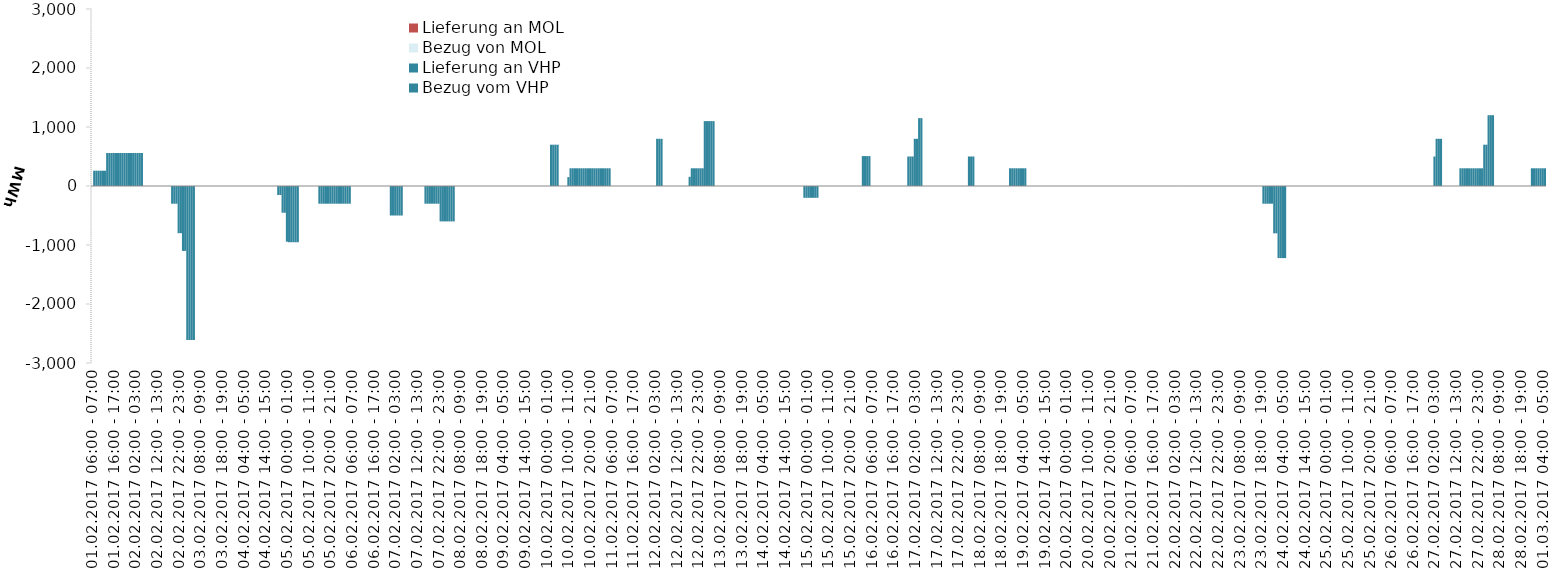
| Category | Bezug vom VHP | Lieferung an VHP | Bezug von MOL | Lieferung an MOL |
|---|---|---|---|---|
| 01.02.2017 06:00 - 07:00 | 0 | 0 | 0 | 0 |
| 01.02.2017 07:00 - 08:00 | 259 | 0 | 0 | 0 |
| 01.02.2017 08:00 - 09:00 | 259 | 0 | 0 | 0 |
| 01.02.2017 09:00 - 10:00 | 259 | 0 | 0 | 0 |
| 01.02.2017 10:00 - 11:00 | 259 | 0 | 0 | 0 |
| 01.02.2017 11:00 - 12:00 | 259 | 0 | 0 | 0 |
| 01.02.2017 12:00 - 13:00 | 259 | 0 | 0 | 0 |
| 01.02.2017 13:00 - 14:00 | 559 | 0 | 0 | 0 |
| 01.02.2017 14:00 - 15:00 | 559 | 0 | 0 | 0 |
| 01.02.2017 15:00 - 16:00 | 559 | 0 | 0 | 0 |
| 01.02.2017 16:00 - 17:00 | 559 | 0 | 0 | 0 |
| 01.02.2017 17:00 - 18:00 | 559 | 0 | 0 | 0 |
| 01.02.2017 18:00 - 19:00 | 559 | 0 | 0 | 0 |
| 01.02.2017 19:00 - 20:00 | 559 | 0 | 0 | 0 |
| 01.02.2017 20:00 - 21:00 | 559 | 0 | 0 | 0 |
| 01.02.2017 21:00 - 22:00 | 559 | 0 | 0 | 0 |
| 01.02.2017 22:00 - 23:00 | 559 | 0 | 0 | 0 |
| 01.02.2017 23:00 - 24:00 | 559 | 0 | 0 | 0 |
| 02.02.2017 00:00 - 01:00 | 559 | 0 | 0 | 0 |
| 02.02.2017 01:00 - 02:00 | 559 | 0 | 0 | 0 |
| 02.02.2017 02:00 - 03:00 | 559 | 0 | 0 | 0 |
| 02.02.2017 03:00 - 04:00 | 559 | 0 | 0 | 0 |
| 02.02.2017 04:00 - 05:00 | 559 | 0 | 0 | 0 |
| 02.02.2017 05:00 - 06:00 | 559 | 0 | 0 | 0 |
| 02.02.2017 06:00 - 07:00 | 0 | 0 | 0 | 0 |
| 02.02.2017 07:00 - 08:00 | 0 | 0 | 0 | 0 |
| 02.02.2017 08:00 - 09:00 | 0 | 0 | 0 | 0 |
| 02.02.2017 09:00 - 10:00 | 0 | 0 | 0 | 0 |
| 02.02.2017 10:00 - 11:00 | 0 | 0 | 0 | 0 |
| 02.02.2017 11:00 - 12:00 | 0 | 0 | 0 | 0 |
| 02.02.2017 12:00 - 13:00 | 0 | 0 | 0 | 0 |
| 02.02.2017 13:00 - 14:00 | 0 | 0 | 0 | 0 |
| 02.02.2017 14:00 - 15:00 | 0 | 0 | 0 | 0 |
| 02.02.2017 15:00 - 16:00 | 0 | 0 | 0 | 0 |
| 02.02.2017 16:00 - 17:00 | 0 | 0 | 0 | 0 |
| 02.02.2017 17:00 - 18:00 | 0 | 0 | 0 | 0 |
| 02.02.2017 18:00 - 19:00 | 0 | 0 | 0 | 0 |
| 02.02.2017 19:00 - 20:00 | 0 | -300 | 0 | 0 |
| 02.02.2017 20:00 - 21:00 | 0 | -300 | 0 | 0 |
| 02.02.2017 21:00 - 22:00 | 0 | -300 | 0 | 0 |
| 02.02.2017 22:00 - 23:00 | 0 | -800 | 0 | 0 |
| 02.02.2017 23:00 - 24:00 | 0 | -800 | 0 | 0 |
| 03.02.2017 00:00 - 01:00 | 0 | -1100 | 0 | 0 |
| 03.02.2017 01:00 - 02:00 | 0 | -1100 | 0 | 0 |
| 03.02.2017 02:00 - 03:00 | 0 | -2610 | 0 | 0 |
| 03.02.2017 03:00 - 04:00 | 0 | -2610 | 0 | 0 |
| 03.02.2017 04:00 - 05:00 | 0 | -2610 | 0 | 0 |
| 03.02.2017 05:00 - 06:00 | 0 | -2610 | 0 | 0 |
| 03.02.2017 06:00 - 07:00 | 0 | 0 | 0 | 0 |
| 03.02.2017 07:00 - 08:00 | 0 | 0 | 0 | 0 |
| 03.02.2017 08:00 - 09:00 | 0 | 0 | 0 | 0 |
| 03.02.2017 09:00 - 10:00 | 0 | 0 | 0 | 0 |
| 03.02.2017 10:00 - 11:00 | 0 | 0 | 0 | 0 |
| 03.02.2017 11:00 - 12:00 | 0 | 0 | 0 | 0 |
| 03.02.2017 12:00 - 13:00 | 0 | 0 | 0 | 0 |
| 03.02.2017 13:00 - 14:00 | 0 | 0 | 0 | 0 |
| 03.02.2017 14:00 - 15:00 | 0 | 0 | 0 | 0 |
| 03.02.2017 15:00 - 16:00 | 0 | 0 | 0 | 0 |
| 03.02.2017 16:00 - 17:00 | 0 | 0 | 0 | 0 |
| 03.02.2017 17:00 - 18:00 | 0 | 0 | 0 | 0 |
| 03.02.2017 18:00 - 19:00 | 0 | 0 | 0 | 0 |
| 03.02.2017 19:00 - 20:00 | 0 | 0 | 0 | 0 |
| 03.02.2017 20:00 - 21:00 | 0 | 0 | 0 | 0 |
| 03.02.2017 21:00 - 22:00 | 0 | 0 | 0 | 0 |
| 03.02.2017 22:00 - 23:00 | 0 | 0 | 0 | 0 |
| 03.02.2017 23:00 - 24:00 | 0 | 0 | 0 | 0 |
| 04.02.2017 00:00 - 01:00 | 0 | 0 | 0 | 0 |
| 04.02.2017 01:00 - 02:00 | 0 | 0 | 0 | 0 |
| 04.02.2017 02:00 - 03:00 | 0 | 0 | 0 | 0 |
| 04.02.2017 03:00 - 04:00 | 0 | 0 | 0 | 0 |
| 04.02.2017 04:00 - 05:00 | 0 | 0 | 0 | 0 |
| 04.02.2017 05:00 - 06:00 | 0 | 0 | 0 | 0 |
| 04.02.2017 06:00 - 07:00 | 0 | 0 | 0 | 0 |
| 04.02.2017 07:00 - 08:00 | 0 | 0 | 0 | 0 |
| 04.02.2017 08:00 - 09:00 | 0 | 0 | 0 | 0 |
| 04.02.2017 09:00 - 10:00 | 0 | 0 | 0 | 0 |
| 04.02.2017 10:00 - 11:00 | 0 | 0 | 0 | 0 |
| 04.02.2017 11:00 - 12:00 | 0 | 0 | 0 | 0 |
| 04.02.2017 12:00 - 13:00 | 0 | 0 | 0 | 0 |
| 04.02.2017 13:00 - 14:00 | 0 | 0 | 0 | 0 |
| 04.02.2017 14:00 - 15:00 | 0 | 0 | 0 | 0 |
| 04.02.2017 15:00 - 16:00 | 0 | 0 | 0 | 0 |
| 04.02.2017 16:00 - 17:00 | 0 | 0 | 0 | 0 |
| 04.02.2017 17:00 - 18:00 | 0 | 0 | 0 | 0 |
| 04.02.2017 18:00 - 19:00 | 0 | 0 | 0 | 0 |
| 04.02.2017 19:00 - 20:00 | 0 | 0 | 0 | 0 |
| 04.02.2017 20:00 - 21:00 | 0 | -153 | 0 | 0 |
| 04.02.2017 21:00 - 22:00 | 0 | -153 | 0 | 0 |
| 04.02.2017 22:00 - 23:00 | 0 | -453 | 0 | 0 |
| 04.02.2017 23:00 - 24:00 | 0 | -453 | 0 | 0 |
| 05.02.2017 00:00 - 01:00 | 0 | -944 | 0 | 0 |
| 05.02.2017 01:00 - 02:00 | 0 | -953 | 0 | 0 |
| 05.02.2017 02:00 - 03:00 | 0 | -953 | 0 | 0 |
| 05.02.2017 03:00 - 04:00 | 0 | -953 | 0 | 0 |
| 05.02.2017 04:00 - 05:00 | 0 | -953 | 0 | 0 |
| 05.02.2017 05:00 - 06:00 | 0 | -953 | 0 | 0 |
| 05.02.2017 06:00 - 07:00 | 0 | 0 | 0 | 0 |
| 05.02.2017 07:00 - 08:00 | 0 | 0 | 0 | 0 |
| 05.02.2017 08:00 - 09:00 | 0 | 0 | 0 | 0 |
| 05.02.2017 09:00 - 10:00 | 0 | 0 | 0 | 0 |
| 05.02.2017 10:00 - 11:00 | 0 | 0 | 0 | 0 |
| 05.02.2017 11:00 - 12:00 | 0 | 0 | 0 | 0 |
| 05.02.2017 12:00 - 13:00 | 0 | 0 | 0 | 0 |
| 05.02.2017 13:00 - 14:00 | 0 | 0 | 0 | 0 |
| 05.02.2017 14:00 - 15:00 | 0 | 0 | 0 | 0 |
| 05.02.2017 15:00 - 16:00 | 0 | -300 | 0 | 0 |
| 05.02.2017 16:00 - 17:00 | 0 | -300 | 0 | 0 |
| 05.02.2017 17:00 - 18:00 | 0 | -300 | 0 | 0 |
| 05.02.2017 18:00 - 19:00 | 0 | -300 | 0 | 0 |
| 05.02.2017 19:00 - 20:00 | 0 | -300 | 0 | 0 |
| 05.02.2017 20:00 - 21:00 | 0 | -300 | 0 | 0 |
| 05.02.2017 21:00 - 22:00 | 0 | -300 | 0 | 0 |
| 05.02.2017 22:00 - 23:00 | 0 | -300 | 0 | 0 |
| 05.02.2017 23:00 - 24:00 | 0 | -300 | 0 | 0 |
| 06.02.2017 00:00 - 01:00 | 0 | -300 | 0 | 0 |
| 06.02.2017 01:00 - 02:00 | 0 | -300 | 0 | 0 |
| 06.02.2017 02:00 - 03:00 | 0 | -300 | 0 | 0 |
| 06.02.2017 03:00 - 04:00 | 0 | -300 | 0 | 0 |
| 06.02.2017 04:00 - 05:00 | 0 | -300 | 0 | 0 |
| 06.02.2017 05:00 - 06:00 | 0 | -300 | 0 | 0 |
| 06.02.2017 06:00 - 07:00 | 0 | 0 | 0 | 0 |
| 06.02.2017 07:00 - 08:00 | 0 | 0 | 0 | 0 |
| 06.02.2017 08:00 - 09:00 | 0 | 0 | 0 | 0 |
| 06.02.2017 09:00 - 10:00 | 0 | 0 | 0 | 0 |
| 06.02.2017 10:00 - 11:00 | 0 | 0 | 0 | 0 |
| 06.02.2017 11:00 - 12:00 | 0 | 0 | 0 | 0 |
| 06.02.2017 12:00 - 13:00 | 0 | 0 | 0 | 0 |
| 06.02.2017 13:00 - 14:00 | 0 | 0 | 0 | 0 |
| 06.02.2017 14:00 - 15:00 | 0 | 0 | 0 | 0 |
| 06.02.2017 15:00 - 16:00 | 0 | 0 | 0 | 0 |
| 06.02.2017 16:00 - 17:00 | 0 | 0 | 0 | 0 |
| 06.02.2017 17:00 - 18:00 | 0 | 0 | 0 | 0 |
| 06.02.2017 18:00 - 19:00 | 0 | 0 | 0 | 0 |
| 06.02.2017 19:00 - 20:00 | 0 | 0 | 0 | 0 |
| 06.02.2017 20:00 - 21:00 | 0 | 0 | 0 | 0 |
| 06.02.2017 21:00 - 22:00 | 0 | 0 | 0 | 0 |
| 06.02.2017 22:00 - 23:00 | 0 | 0 | 0 | 0 |
| 06.02.2017 23:00 - 24:00 | 0 | 0 | 0 | 0 |
| 07.02.2017 00:00 - 01:00 | 0 | -500 | 0 | 0 |
| 07.02.2017 01:00 - 02:00 | 0 | -500 | 0 | 0 |
| 07.02.2017 02:00 - 03:00 | 0 | -500 | 0 | 0 |
| 07.02.2017 03:00 - 04:00 | 0 | -500 | 0 | 0 |
| 07.02.2017 04:00 - 05:00 | 0 | -500 | 0 | 0 |
| 07.02.2017 05:00 - 06:00 | 0 | -500 | 0 | 0 |
| 07.02.2017 06:00 - 07:00 | 0 | 0 | 0 | 0 |
| 07.02.2017 07:00 - 08:00 | 0 | 0 | 0 | 0 |
| 07.02.2017 08:00 - 09:00 | 0 | 0 | 0 | 0 |
| 07.02.2017 09:00 - 10:00 | 0 | 0 | 0 | 0 |
| 07.02.2017 10:00 - 11:00 | 0 | 0 | 0 | 0 |
| 07.02.2017 11:00 - 12:00 | 0 | 0 | 0 | 0 |
| 07.02.2017 12:00 - 13:00 | 0 | 0 | 0 | 0 |
| 07.02.2017 13:00 - 14:00 | 0 | 0 | 0 | 0 |
| 07.02.2017 14:00 - 15:00 | 0 | 0 | 0 | 0 |
| 07.02.2017 15:00 - 16:00 | 0 | 0 | 0 | 0 |
| 07.02.2017 16:00 - 17:00 | 0 | -300 | 0 | 0 |
| 07.02.2017 17:00 - 18:00 | 0 | -300 | 0 | 0 |
| 07.02.2017 18:00 - 19:00 | 0 | -300 | 0 | 0 |
| 07.02.2017 19:00 - 20:00 | 0 | -300 | 0 | 0 |
| 07.02.2017 20:00 - 21:00 | 0 | -300 | 0 | 0 |
| 07.02.2017 21:00 - 22:00 | 0 | -300 | 0 | 0 |
| 07.02.2017 22:00 - 23:00 | 0 | -300 | 0 | 0 |
| 07.02.2017 23:00 - 24:00 | 0 | -600 | 0 | 0 |
| 08.02.2017 00:00 - 01:00 | 0 | -600 | 0 | 0 |
| 08.02.2017 01:00 - 02:00 | 0 | -600 | 0 | 0 |
| 08.02.2017 02:00 - 03:00 | 0 | -600 | 0 | 0 |
| 08.02.2017 03:00 - 04:00 | 0 | -600 | 0 | 0 |
| 08.02.2017 04:00 - 05:00 | 0 | -600 | 0 | 0 |
| 08.02.2017 05:00 - 06:00 | 0 | -600 | 0 | 0 |
| 08.02.2017 06:00 - 07:00 | 0 | 0 | 0 | 0 |
| 08.02.2017 07:00 - 08:00 | 0 | 0 | 0 | 0 |
| 08.02.2017 08:00 - 09:00 | 0 | 0 | 0 | 0 |
| 08.02.2017 09:00 - 10:00 | 0 | 0 | 0 | 0 |
| 08.02.2017 10:00 - 11:00 | 0 | 0 | 0 | 0 |
| 08.02.2017 11:00 - 12:00 | 0 | 0 | 0 | 0 |
| 08.02.2017 12:00 - 13:00 | 0 | 0 | 0 | 0 |
| 08.02.2017 13:00 - 14:00 | 0 | 0 | 0 | 0 |
| 08.02.2017 14:00 - 15:00 | 0 | 0 | 0 | 0 |
| 08.02.2017 15:00 - 16:00 | 0 | 0 | 0 | 0 |
| 08.02.2017 16:00 - 17:00 | 0 | 0 | 0 | 0 |
| 08.02.2017 17:00 - 18:00 | 0 | 0 | 0 | 0 |
| 08.02.2017 18:00 - 19:00 | 0 | 0 | 0 | 0 |
| 08.02.2017 19:00 - 20:00 | 0 | 0 | 0 | 0 |
| 08.02.2017 20:00 - 21:00 | 0 | 0 | 0 | 0 |
| 08.02.2017 21:00 - 22:00 | 0 | 0 | 0 | 0 |
| 08.02.2017 22:00 - 23:00 | 0 | 0 | 0 | 0 |
| 08.02.2017 23:00 - 24:00 | 0 | 0 | 0 | 0 |
| 09.02.2017 00:00 - 01:00 | 0 | 0 | 0 | 0 |
| 09.02.2017 01:00 - 02:00 | 0 | 0 | 0 | 0 |
| 09.02.2017 02:00 - 03:00 | 0 | 0 | 0 | 0 |
| 09.02.2017 03:00 - 04:00 | 0 | 0 | 0 | 0 |
| 09.02.2017 04:00 - 05:00 | 0 | 0 | 0 | 0 |
| 09.02.2017 05:00 - 06:00 | 0 | 0 | 0 | 0 |
| 09.02.2017 06:00 - 07:00 | 0 | 0 | 0 | 0 |
| 09.02.2017 07:00 - 08:00 | 0 | 0 | 0 | 0 |
| 09.02.2017 08:00 - 09:00 | 0 | 0 | 0 | 0 |
| 09.02.2017 09:00 - 10:00 | 0 | 0 | 0 | 0 |
| 09.02.2017 10:00 - 11:00 | 0 | 0 | 0 | 0 |
| 09.02.2017 11:00 - 12:00 | 0 | 0 | 0 | 0 |
| 09.02.2017 12:00 - 13:00 | 0 | 0 | 0 | 0 |
| 09.02.2017 13:00 - 14:00 | 0 | 0 | 0 | 0 |
| 09.02.2017 14:00 - 15:00 | 0 | 0 | 0 | 0 |
| 09.02.2017 15:00 - 16:00 | 0 | 0 | 0 | 0 |
| 09.02.2017 16:00 - 17:00 | 0 | 0 | 0 | 0 |
| 09.02.2017 17:00 - 18:00 | 0 | 0 | 0 | 0 |
| 09.02.2017 18:00 - 19:00 | 0 | 0 | 0 | 0 |
| 09.02.2017 19:00 - 20:00 | 0 | 0 | 0 | 0 |
| 09.02.2017 20:00 - 21:00 | 0 | 0 | 0 | 0 |
| 09.02.2017 21:00 - 22:00 | 0 | 0 | 0 | 0 |
| 09.02.2017 22:00 - 23:00 | 0 | 0 | 0 | 0 |
| 09.02.2017 23:00 - 24:00 | 0 | 0 | 0 | 0 |
| 10.02.2017 00:00 - 01:00 | 0 | 0 | 0 | 0 |
| 10.02.2017 01:00 - 02:00 | 0 | 0 | 0 | 0 |
| 10.02.2017 02:00 - 03:00 | 700 | 0 | 0 | 0 |
| 10.02.2017 03:00 - 04:00 | 700 | 0 | 0 | 0 |
| 10.02.2017 04:00 - 05:00 | 700 | 0 | 0 | 0 |
| 10.02.2017 05:00 - 06:00 | 700 | 0 | 0 | 0 |
| 10.02.2017 06:00 - 07:00 | 0 | 0 | 0 | 0 |
| 10.02.2017 07:00 - 08:00 | 0 | 0 | 0 | 0 |
| 10.02.2017 08:00 - 09:00 | 0 | 0 | 0 | 0 |
| 10.02.2017 09:00 - 10:00 | 0 | 0 | 0 | 0 |
| 10.02.2017 10:00 - 11:00 | 150 | 0 | 0 | 0 |
| 10.02.2017 11:00 - 12:00 | 300 | 0 | 0 | 0 |
| 10.02.2017 12:00 - 13:00 | 300 | 0 | 0 | 0 |
| 10.02.2017 13:00 - 14:00 | 300 | 0 | 0 | 0 |
| 10.02.2017 14:00 - 15:00 | 300 | 0 | 0 | 0 |
| 10.02.2017 15:00 - 16:00 | 300 | 0 | 0 | 0 |
| 10.02.2017 16:00 - 17:00 | 300 | 0 | 0 | 0 |
| 10.02.2017 17:00 - 18:00 | 300 | 0 | 0 | 0 |
| 10.02.2017 18:00 - 19:00 | 300 | 0 | 0 | 0 |
| 10.02.2017 19:00 - 20:00 | 300 | 0 | 0 | 0 |
| 10.02.2017 20:00 - 21:00 | 300 | 0 | 0 | 0 |
| 10.02.2017 21:00 - 22:00 | 300 | 0 | 0 | 0 |
| 10.02.2017 22:00 - 23:00 | 300 | 0 | 0 | 0 |
| 10.02.2017 23:00 - 24:00 | 300 | 0 | 0 | 0 |
| 11.02.2017 00:00 - 01:00 | 300 | 0 | 0 | 0 |
| 11.02.2017 01:00 - 02:00 | 300 | 0 | 0 | 0 |
| 11.02.2017 02:00 - 03:00 | 300 | 0 | 0 | 0 |
| 11.02.2017 03:00 - 04:00 | 300 | 0 | 0 | 0 |
| 11.02.2017 04:00 - 05:00 | 300 | 0 | 0 | 0 |
| 11.02.2017 05:00 - 06:00 | 300 | 0 | 0 | 0 |
| 11.02.2017 06:00 - 07:00 | 0 | 0 | 0 | 0 |
| 11.02.2017 07:00 - 08:00 | 0 | 0 | 0 | 0 |
| 11.02.2017 08:00 - 09:00 | 0 | 0 | 0 | 0 |
| 11.02.2017 09:00 - 10:00 | 0 | 0 | 0 | 0 |
| 11.02.2017 10:00 - 11:00 | 0 | 0 | 0 | 0 |
| 11.02.2017 11:00 - 12:00 | 0 | 0 | 0 | 0 |
| 11.02.2017 12:00 - 13:00 | 0 | 0 | 0 | 0 |
| 11.02.2017 13:00 - 14:00 | 0 | 0 | 0 | 0 |
| 11.02.2017 14:00 - 15:00 | 0 | 0 | 0 | 0 |
| 11.02.2017 15:00 - 16:00 | 0 | 0 | 0 | 0 |
| 11.02.2017 16:00 - 17:00 | 0 | 0 | 0 | 0 |
| 11.02.2017 17:00 - 18:00 | 0 | 0 | 0 | 0 |
| 11.02.2017 18:00 - 19:00 | 0 | 0 | 0 | 0 |
| 11.02.2017 19:00 - 20:00 | 0 | 0 | 0 | 0 |
| 11.02.2017 20:00 - 21:00 | 0 | 0 | 0 | 0 |
| 11.02.2017 21:00 - 22:00 | 0 | 0 | 0 | 0 |
| 11.02.2017 22:00 - 23:00 | 0 | 0 | 0 | 0 |
| 11.02.2017 23:00 - 24:00 | 0 | 0 | 0 | 0 |
| 12.02.2017 00:00 - 01:00 | 0 | 0 | 0 | 0 |
| 12.02.2017 01:00 - 02:00 | 0 | 0 | 0 | 0 |
| 12.02.2017 02:00 - 03:00 | 0 | 0 | 0 | 0 |
| 12.02.2017 03:00 - 04:00 | 800 | 0 | 0 | 0 |
| 12.02.2017 04:00 - 05:00 | 800 | 0 | 0 | 0 |
| 12.02.2017 05:00 - 06:00 | 800 | 0 | 0 | 0 |
| 12.02.2017 06:00 - 07:00 | 0 | 0 | 0 | 0 |
| 12.02.2017 07:00 - 08:00 | 0 | 0 | 0 | 0 |
| 12.02.2017 08:00 - 09:00 | 0 | 0 | 0 | 0 |
| 12.02.2017 09:00 - 10:00 | 0 | 0 | 0 | 0 |
| 12.02.2017 10:00 - 11:00 | 0 | 0 | 0 | 0 |
| 12.02.2017 11:00 - 12:00 | 0 | 0 | 0 | 0 |
| 12.02.2017 12:00 - 13:00 | 0 | 0 | 0 | 0 |
| 12.02.2017 13:00 - 14:00 | 0 | 0 | 0 | 0 |
| 12.02.2017 14:00 - 15:00 | 0 | 0 | 0 | 0 |
| 12.02.2017 15:00 - 16:00 | 0 | 0 | 0 | 0 |
| 12.02.2017 16:00 - 17:00 | 0 | 0 | 0 | 0 |
| 12.02.2017 17:00 - 18:00 | 0 | 0 | 0 | 0 |
| 12.02.2017 18:00 - 19:00 | 156 | 0 | 0 | 0 |
| 12.02.2017 19:00 - 20:00 | 300 | 0 | 0 | 0 |
| 12.02.2017 20:00 - 21:00 | 300 | 0 | 0 | 0 |
| 12.02.2017 21:00 - 22:00 | 300 | 0 | 0 | 0 |
| 12.02.2017 22:00 - 23:00 | 300 | 0 | 0 | 0 |
| 12.02.2017 23:00 - 24:00 | 300 | 0 | 0 | 0 |
| 13.02.2017 00:00 - 01:00 | 300 | 0 | 0 | 0 |
| 13.02.2017 01:00 - 02:00 | 1100 | 0 | 0 | 0 |
| 13.02.2017 02:00 - 03:00 | 1100 | 0 | 0 | 0 |
| 13.02.2017 03:00 - 04:00 | 1100 | 0 | 0 | 0 |
| 13.02.2017 04:00 - 05:00 | 1100 | 0 | 0 | 0 |
| 13.02.2017 05:00 - 06:00 | 1100 | 0 | 0 | 0 |
| 13.02.2017 06:00 - 07:00 | 0 | 0 | 0 | 0 |
| 13.02.2017 07:00 - 08:00 | 0 | 0 | 0 | 0 |
| 13.02.2017 08:00 - 09:00 | 0 | 0 | 0 | 0 |
| 13.02.2017 09:00 - 10:00 | 0 | 0 | 0 | 0 |
| 13.02.2017 10:00 - 11:00 | 0 | 0 | 0 | 0 |
| 13.02.2017 11:00 - 12:00 | 0 | 0 | 0 | 0 |
| 13.02.2017 12:00 - 13:00 | 0 | 0 | 0 | 0 |
| 13.02.2017 13:00 - 14:00 | 0 | 0 | 0 | 0 |
| 13.02.2017 14:00 - 15:00 | 0 | 0 | 0 | 0 |
| 13.02.2017 15:00 - 16:00 | 0 | 0 | 0 | 0 |
| 13.02.2017 16:00 - 17:00 | 0 | 0 | 0 | 0 |
| 13.02.2017 17:00 - 18:00 | 0 | 0 | 0 | 0 |
| 13.02.2017 18:00 - 19:00 | 0 | 0 | 0 | 0 |
| 13.02.2017 19:00 - 20:00 | 0 | 0 | 0 | 0 |
| 13.02.2017 20:00 - 21:00 | 0 | 0 | 0 | 0 |
| 13.02.2017 21:00 - 22:00 | 0 | 0 | 0 | 0 |
| 13.02.2017 22:00 - 23:00 | 0 | 0 | 0 | 0 |
| 13.02.2017 23:00 - 24:00 | 0 | 0 | 0 | 0 |
| 14.02.2017 00:00 - 01:00 | 0 | 0 | 0 | 0 |
| 14.02.2017 01:00 - 02:00 | 0 | 0 | 0 | 0 |
| 14.02.2017 02:00 - 03:00 | 0 | 0 | 0 | 0 |
| 14.02.2017 03:00 - 04:00 | 0 | 0 | 0 | 0 |
| 14.02.2017 04:00 - 05:00 | 0 | 0 | 0 | 0 |
| 14.02.2017 05:00 - 06:00 | 0 | 0 | 0 | 0 |
| 14.02.2017 06:00 - 07:00 | 0 | 0 | 0 | 0 |
| 14.02.2017 07:00 - 08:00 | 0 | 0 | 0 | 0 |
| 14.02.2017 08:00 - 09:00 | 0 | 0 | 0 | 0 |
| 14.02.2017 09:00 - 10:00 | 0 | 0 | 0 | 0 |
| 14.02.2017 10:00 - 11:00 | 0 | 0 | 0 | 0 |
| 14.02.2017 11:00 - 12:00 | 0 | 0 | 0 | 0 |
| 14.02.2017 12:00 - 13:00 | 0 | 0 | 0 | 0 |
| 14.02.2017 13:00 - 14:00 | 0 | 0 | 0 | 0 |
| 14.02.2017 14:00 - 15:00 | 0 | 0 | 0 | 0 |
| 14.02.2017 15:00 - 16:00 | 0 | 0 | 0 | 0 |
| 14.02.2017 16:00 - 17:00 | 0 | 0 | 0 | 0 |
| 14.02.2017 17:00 - 18:00 | 0 | 0 | 0 | 0 |
| 14.02.2017 18:00 - 19:00 | 0 | 0 | 0 | 0 |
| 14.02.2017 19:00 - 20:00 | 0 | 0 | 0 | 0 |
| 14.02.2017 20:00 - 21:00 | 0 | 0 | 0 | 0 |
| 14.02.2017 21:00 - 22:00 | 0 | 0 | 0 | 0 |
| 14.02.2017 22:00 - 23:00 | 0 | 0 | 0 | 0 |
| 14.02.2017 23:00 - 24:00 | 0 | -200 | 0 | 0 |
| 15.02.2017 00:00 - 01:00 | 0 | -200 | 0 | 0 |
| 15.02.2017 01:00 - 02:00 | 0 | -200 | 0 | 0 |
| 15.02.2017 02:00 - 03:00 | 0 | -200 | 0 | 0 |
| 15.02.2017 03:00 - 04:00 | 0 | -200 | 0 | 0 |
| 15.02.2017 04:00 - 05:00 | 0 | -200 | 0 | 0 |
| 15.02.2017 05:00 - 06:00 | 0 | -200 | 0 | 0 |
| 15.02.2017 06:00 - 07:00 | 0 | 0 | 0 | 0 |
| 15.02.2017 07:00 - 08:00 | 0 | 0 | 0 | 0 |
| 15.02.2017 08:00 - 09:00 | 0 | 0 | 0 | 0 |
| 15.02.2017 09:00 - 10:00 | 0 | 0 | 0 | 0 |
| 15.02.2017 10:00 - 11:00 | 0 | 0 | 0 | 0 |
| 15.02.2017 11:00 - 12:00 | 0 | 0 | 0 | 0 |
| 15.02.2017 12:00 - 13:00 | 0 | 0 | 0 | 0 |
| 15.02.2017 13:00 - 14:00 | 0 | 0 | 0 | 0 |
| 15.02.2017 14:00 - 15:00 | 0 | 0 | 0 | 0 |
| 15.02.2017 15:00 - 16:00 | 0 | 0 | 0 | 0 |
| 15.02.2017 16:00 - 17:00 | 0 | 0 | 0 | 0 |
| 15.02.2017 17:00 - 18:00 | 0 | 0 | 0 | 0 |
| 15.02.2017 18:00 - 19:00 | 0 | 0 | 0 | 0 |
| 15.02.2017 19:00 - 20:00 | 0 | 0 | 0 | 0 |
| 15.02.2017 20:00 - 21:00 | 0 | 0 | 0 | 0 |
| 15.02.2017 21:00 - 22:00 | 0 | 0 | 0 | 0 |
| 15.02.2017 22:00 - 23:00 | 0 | 0 | 0 | 0 |
| 15.02.2017 23:00 - 24:00 | 0 | 0 | 0 | 0 |
| 16.02.2017 00:00 - 01:00 | 0 | 0 | 0 | 0 |
| 16.02.2017 01:00 - 02:00 | 0 | 0 | 0 | 0 |
| 16.02.2017 02:00 - 03:00 | 507 | 0 | 0 | 0 |
| 16.02.2017 03:00 - 04:00 | 507 | 0 | 0 | 0 |
| 16.02.2017 04:00 - 05:00 | 507 | 0 | 0 | 0 |
| 16.02.2017 05:00 - 06:00 | 507 | 0 | 0 | 0 |
| 16.02.2017 06:00 - 07:00 | 0 | 0 | 0 | 0 |
| 16.02.2017 07:00 - 08:00 | 0 | 0 | 0 | 0 |
| 16.02.2017 08:00 - 09:00 | 0 | 0 | 0 | 0 |
| 16.02.2017 09:00 - 10:00 | 0 | 0 | 0 | 0 |
| 16.02.2017 10:00 - 11:00 | 0 | 0 | 0 | 0 |
| 16.02.2017 11:00 - 12:00 | 0 | 0 | 0 | 0 |
| 16.02.2017 12:00 - 13:00 | 0 | 0 | 0 | 0 |
| 16.02.2017 13:00 - 14:00 | 0 | 0 | 0 | 0 |
| 16.02.2017 14:00 - 15:00 | 0 | 0 | 0 | 0 |
| 16.02.2017 15:00 - 16:00 | 0 | 0 | 0 | 0 |
| 16.02.2017 16:00 - 17:00 | 0 | 0 | 0 | 0 |
| 16.02.2017 17:00 - 18:00 | 0 | 0 | 0 | 0 |
| 16.02.2017 18:00 - 19:00 | 0 | 0 | 0 | 0 |
| 16.02.2017 19:00 - 20:00 | 0 | 0 | 0 | 0 |
| 16.02.2017 20:00 - 21:00 | 0 | 0 | 0 | 0 |
| 16.02.2017 21:00 - 22:00 | 0 | 0 | 0 | 0 |
| 16.02.2017 22:00 - 23:00 | 0 | 0 | 0 | 0 |
| 16.02.2017 23:00 - 24:00 | 500 | 0 | 0 | 0 |
| 17.02.2017 00:00 - 01:00 | 500 | 0 | 0 | 0 |
| 17.02.2017 01:00 - 02:00 | 500 | 0 | 0 | 0 |
| 17.02.2017 02:00 - 03:00 | 800 | 0 | 0 | 0 |
| 17.02.2017 03:00 - 04:00 | 800 | 0 | 0 | 0 |
| 17.02.2017 04:00 - 05:00 | 1150 | 0 | 0 | 0 |
| 17.02.2017 05:00 - 06:00 | 1150 | 0 | 0 | 0 |
| 17.02.2017 06:00 - 07:00 | 0 | 0 | 0 | 0 |
| 17.02.2017 07:00 - 08:00 | 0 | 0 | 0 | 0 |
| 17.02.2017 08:00 - 09:00 | 0 | 0 | 0 | 0 |
| 17.02.2017 09:00 - 10:00 | 0 | 0 | 0 | 0 |
| 17.02.2017 10:00 - 11:00 | 0 | 0 | 0 | 0 |
| 17.02.2017 11:00 - 12:00 | 0 | 0 | 0 | 0 |
| 17.02.2017 12:00 - 13:00 | 0 | 0 | 0 | 0 |
| 17.02.2017 13:00 - 14:00 | 0 | 0 | 0 | 0 |
| 17.02.2017 14:00 - 15:00 | 0 | 0 | 0 | 0 |
| 17.02.2017 15:00 - 16:00 | 0 | 0 | 0 | 0 |
| 17.02.2017 16:00 - 17:00 | 0 | 0 | 0 | 0 |
| 17.02.2017 17:00 - 18:00 | 0 | 0 | 0 | 0 |
| 17.02.2017 18:00 - 19:00 | 0 | 0 | 0 | 0 |
| 17.02.2017 19:00 - 20:00 | 0 | 0 | 0 | 0 |
| 17.02.2017 20:00 - 21:00 | 0 | 0 | 0 | 0 |
| 17.02.2017 21:00 - 22:00 | 0 | 0 | 0 | 0 |
| 17.02.2017 22:00 - 23:00 | 0 | 0 | 0 | 0 |
| 17.02.2017 23:00 - 24:00 | 0 | 0 | 0 | 0 |
| 18.02.2017 00:00 - 01:00 | 0 | 0 | 0 | 0 |
| 18.02.2017 01:00 - 02:00 | 0 | 0 | 0 | 0 |
| 18.02.2017 02:00 - 03:00 | 0 | 0 | 0 | 0 |
| 18.02.2017 03:00 - 04:00 | 500 | 0 | 0 | 0 |
| 18.02.2017 04:00 - 05:00 | 500 | 0 | 0 | 0 |
| 18.02.2017 05:00 - 06:00 | 500 | 0 | 0 | 0 |
| 18.02.2017 06:00 - 07:00 | 0 | 0 | 0 | 0 |
| 18.02.2017 07:00 - 08:00 | 0 | 0 | 0 | 0 |
| 18.02.2017 08:00 - 09:00 | 0 | 0 | 0 | 0 |
| 18.02.2017 09:00 - 10:00 | 0 | 0 | 0 | 0 |
| 18.02.2017 10:00 - 11:00 | 0 | 0 | 0 | 0 |
| 18.02.2017 11:00 - 12:00 | 0 | 0 | 0 | 0 |
| 18.02.2017 12:00 - 13:00 | 0 | 0 | 0 | 0 |
| 18.02.2017 13:00 - 14:00 | 0 | 0 | 0 | 0 |
| 18.02.2017 14:00 - 15:00 | 0 | 0 | 0 | 0 |
| 18.02.2017 15:00 - 16:00 | 0 | 0 | 0 | 0 |
| 18.02.2017 16:00 - 17:00 | 0 | 0 | 0 | 0 |
| 18.02.2017 17:00 - 18:00 | 0 | 0 | 0 | 0 |
| 18.02.2017 18:00 - 19:00 | 0 | 0 | 0 | 0 |
| 18.02.2017 19:00 - 20:00 | 0 | 0 | 0 | 0 |
| 18.02.2017 20:00 - 21:00 | 0 | 0 | 0 | 0 |
| 18.02.2017 21:00 - 22:00 | 0 | 0 | 0 | 0 |
| 18.02.2017 22:00 - 23:00 | 300 | 0 | 0 | 0 |
| 18.02.2017 23:00 - 24:00 | 300 | 0 | 0 | 0 |
| 19.02.2017 00:00 - 01:00 | 300 | 0 | 0 | 0 |
| 19.02.2017 01:00 - 02:00 | 300 | 0 | 0 | 0 |
| 19.02.2017 02:00 - 03:00 | 300 | 0 | 0 | 0 |
| 19.02.2017 03:00 - 04:00 | 300 | 0 | 0 | 0 |
| 19.02.2017 04:00 - 05:00 | 300 | 0 | 0 | 0 |
| 19.02.2017 05:00 - 06:00 | 300 | 0 | 0 | 0 |
| 19.02.2017 06:00 - 07:00 | 0 | 0 | 0 | 0 |
| 19.02.2017 07:00 - 08:00 | 0 | 0 | 0 | 0 |
| 19.02.2017 08:00 - 09:00 | 0 | 0 | 0 | 0 |
| 19.02.2017 09:00 - 10:00 | 0 | 0 | 0 | 0 |
| 19.02.2017 10:00 - 11:00 | 0 | 0 | 0 | 0 |
| 19.02.2017 11:00 - 12:00 | 0 | 0 | 0 | 0 |
| 19.02.2017 12:00 - 13:00 | 0 | 0 | 0 | 0 |
| 19.02.2017 13:00 - 14:00 | 0 | 0 | 0 | 0 |
| 19.02.2017 14:00 - 15:00 | 0 | 0 | 0 | 0 |
| 19.02.2017 15:00 - 16:00 | 0 | 0 | 0 | 0 |
| 19.02.2017 16:00 - 17:00 | 0 | 0 | 0 | 0 |
| 19.02.2017 17:00 - 18:00 | 0 | 0 | 0 | 0 |
| 19.02.2017 18:00 - 19:00 | 0 | 0 | 0 | 0 |
| 19.02.2017 19:00 - 20:00 | 0 | 0 | 0 | 0 |
| 19.02.2017 20:00 - 21:00 | 0 | 0 | 0 | 0 |
| 19.02.2017 21:00 - 22:00 | 0 | 0 | 0 | 0 |
| 19.02.2017 22:00 - 23:00 | 0 | 0 | 0 | 0 |
| 19.02.2017 23:00 - 24:00 | 0 | 0 | 0 | 0 |
| 20.02.2017 00:00 - 01:00 | 0 | 0 | 0 | 0 |
| 20.02.2017 01:00 - 02:00 | 0 | 0 | 0 | 0 |
| 20.02.2017 02:00 - 03:00 | 0 | 0 | 0 | 0 |
| 20.02.2017 03:00 - 04:00 | 0 | 0 | 0 | 0 |
| 20.02.2017 04:00 - 05:00 | 0 | 0 | 0 | 0 |
| 20.02.2017 05:00 - 06:00 | 0 | 0 | 0 | 0 |
| 20.02.2017 06:00 - 07:00 | 0 | 0 | 0 | 0 |
| 20.02.2017 07:00 - 08:00 | 0 | 0 | 0 | 0 |
| 20.02.2017 08:00 - 09:00 | 0 | 0 | 0 | 0 |
| 20.02.2017 09:00 - 10:00 | 0 | 0 | 0 | 0 |
| 20.02.2017 10:00 - 11:00 | 0 | 0 | 0 | 0 |
| 20.02.2017 11:00 - 12:00 | 0 | 0 | 0 | 0 |
| 20.02.2017 12:00 - 13:00 | 0 | 0 | 0 | 0 |
| 20.02.2017 13:00 - 14:00 | 0 | 0 | 0 | 0 |
| 20.02.2017 14:00 - 15:00 | 0 | 0 | 0 | 0 |
| 20.02.2017 15:00 - 16:00 | 0 | 0 | 0 | 0 |
| 20.02.2017 16:00 - 17:00 | 0 | 0 | 0 | 0 |
| 20.02.2017 17:00 - 18:00 | 0 | 0 | 0 | 0 |
| 20.02.2017 18:00 - 19:00 | 0 | 0 | 0 | 0 |
| 20.02.2017 19:00 - 20:00 | 0 | 0 | 0 | 0 |
| 20.02.2017 20:00 - 21:00 | 0 | 0 | 0 | 0 |
| 20.02.2017 21:00 - 22:00 | 0 | 0 | 0 | 0 |
| 20.02.2017 22:00 - 23:00 | 0 | 0 | 0 | 0 |
| 20.02.2017 23:00 - 24:00 | 0 | 0 | 0 | 0 |
| 21.02.2017 00:00 - 01:00 | 0 | 0 | 0 | 0 |
| 21.02.2017 01:00 - 02:00 | 0 | 0 | 0 | 0 |
| 21.02.2017 02:00 - 03:00 | 0 | 0 | 0 | 0 |
| 21.02.2017 03:00 - 04:00 | 0 | 0 | 0 | 0 |
| 21.02.2017 04:00 - 05:00 | 0 | 0 | 0 | 0 |
| 21.02.2017 05:00 - 06:00 | 0 | 0 | 0 | 0 |
| 21.02.2017 06:00 - 07:00 | 0 | 0 | 0 | 0 |
| 21.02.2017 07:00 - 08:00 | 0 | 0 | 0 | 0 |
| 21.02.2017 08:00 - 09:00 | 0 | 0 | 0 | 0 |
| 21.02.2017 09:00 - 10:00 | 0 | 0 | 0 | 0 |
| 21.02.2017 10:00 - 11:00 | 0 | 0 | 0 | 0 |
| 21.02.2017 11:00 - 12:00 | 0 | 0 | 0 | 0 |
| 21.02.2017 12:00 - 13:00 | 0 | 0 | 0 | 0 |
| 21.02.2017 13:00 - 14:00 | 0 | 0 | 0 | 0 |
| 21.02.2017 14:00 - 15:00 | 0 | 0 | 0 | 0 |
| 21.02.2017 15:00 - 16:00 | 0 | 0 | 0 | 0 |
| 21.02.2017 16:00 - 17:00 | 0 | 0 | 0 | 0 |
| 21.02.2017 17:00 - 18:00 | 0 | 0 | 0 | 0 |
| 21.02.2017 18:00 - 19:00 | 0 | 0 | 0 | 0 |
| 21.02.2017 19:00 - 20:00 | 0 | 0 | 0 | 0 |
| 21.02.2017 20:00 - 21:00 | 0 | 0 | 0 | 0 |
| 21.02.2017 21:00 - 22:00 | 0 | 0 | 0 | 0 |
| 21.02.2017 22:00 - 23:00 | 0 | 0 | 0 | 0 |
| 21.02.2017 23:00 - 24:00 | 0 | 0 | 0 | 0 |
| 22.02.2017 00:00 - 01:00 | 0 | 0 | 0 | 0 |
| 22.02.2017 01:00 - 02:00 | 0 | 0 | 0 | 0 |
| 22.02.2017 02:00 - 03:00 | 0 | 0 | 0 | 0 |
| 22.02.2017 03:00 - 04:00 | 0 | 0 | 0 | 0 |
| 22.02.2017 04:00 - 05:00 | 0 | 0 | 0 | 0 |
| 22.02.2017 05:00 - 06:00 | 0 | 0 | 0 | 0 |
| 22.02.2017 06:00 - 07:00 | 0 | 0 | 0 | 0 |
| 22.02.2017 07:00 - 08:00 | 0 | 0 | 0 | 0 |
| 22.02.2017 08:00 - 09:00 | 0 | 0 | 0 | 0 |
| 22.02.2017 09:00 - 10:00 | 0 | 0 | 0 | 0 |
| 22.02.2017 10:00 - 11:00 | 0 | 0 | 0 | 0 |
| 22.02.2017 11:00 - 12:00 | 0 | 0 | 0 | 0 |
| 22.02.2017 12:00 - 13:00 | 0 | 0 | 0 | 0 |
| 22.02.2017 13:00 - 14:00 | 0 | 0 | 0 | 0 |
| 22.02.2017 14:00 - 15:00 | 0 | 0 | 0 | 0 |
| 22.02.2017 15:00 - 16:00 | 0 | 0 | 0 | 0 |
| 22.02.2017 16:00 - 17:00 | 0 | 0 | 0 | 0 |
| 22.02.2017 17:00 - 18:00 | 0 | 0 | 0 | 0 |
| 22.02.2017 18:00 - 19:00 | 0 | 0 | 0 | 0 |
| 22.02.2017 19:00 - 20:00 | 0 | 0 | 0 | 0 |
| 22.02.2017 20:00 - 21:00 | 0 | 0 | 0 | 0 |
| 22.02.2017 21:00 - 22:00 | 0 | 0 | 0 | 0 |
| 22.02.2017 22:00 - 23:00 | 0 | 0 | 0 | 0 |
| 22.02.2017 23:00 - 24:00 | 0 | 0 | 0 | 0 |
| 23.02.2017 00:00 - 01:00 | 0 | 0 | 0 | 0 |
| 23.02.2017 01:00 - 02:00 | 0 | 0 | 0 | 0 |
| 23.02.2017 02:00 - 03:00 | 0 | 0 | 0 | 0 |
| 23.02.2017 03:00 - 04:00 | 0 | 0 | 0 | 0 |
| 23.02.2017 04:00 - 05:00 | 0 | 0 | 0 | 0 |
| 23.02.2017 05:00 - 06:00 | 0 | 0 | 0 | 0 |
| 23.02.2017 06:00 - 07:00 | 0 | 0 | 0 | 0 |
| 23.02.2017 07:00 - 08:00 | 0 | 0 | 0 | 0 |
| 23.02.2017 08:00 - 09:00 | 0 | 0 | 0 | 0 |
| 23.02.2017 09:00 - 10:00 | 0 | 0 | 0 | 0 |
| 23.02.2017 10:00 - 11:00 | 0 | 0 | 0 | 0 |
| 23.02.2017 11:00 - 12:00 | 0 | 0 | 0 | 0 |
| 23.02.2017 12:00 - 13:00 | 0 | 0 | 0 | 0 |
| 23.02.2017 13:00 - 14:00 | 0 | 0 | 0 | 0 |
| 23.02.2017 14:00 - 15:00 | 0 | 0 | 0 | 0 |
| 23.02.2017 15:00 - 16:00 | 0 | 0 | 0 | 0 |
| 23.02.2017 16:00 - 17:00 | 0 | 0 | 0 | 0 |
| 23.02.2017 17:00 - 18:00 | 0 | 0 | 0 | 0 |
| 23.02.2017 18:00 - 19:00 | 0 | 0 | 0 | 0 |
| 23.02.2017 19:00 - 20:00 | 0 | -300 | 0 | 0 |
| 23.02.2017 20:00 - 21:00 | 0 | -300 | 0 | 0 |
| 23.02.2017 21:00 - 22:00 | 0 | -300 | 0 | 0 |
| 23.02.2017 22:00 - 23:00 | 0 | -300 | 0 | 0 |
| 23.02.2017 23:00 - 24:00 | 0 | -300 | 0 | 0 |
| 24.02.2017 00:00 - 01:00 | 0 | -802 | 0 | 0 |
| 24.02.2017 01:00 - 02:00 | 0 | -802 | 0 | 0 |
| 24.02.2017 02:00 - 03:00 | 0 | -1222 | 0 | 0 |
| 24.02.2017 03:00 - 04:00 | 0 | -1222 | 0 | 0 |
| 24.02.2017 04:00 - 05:00 | 0 | -1222 | 0 | 0 |
| 24.02.2017 05:00 - 06:00 | 0 | -1222 | 0 | 0 |
| 24.02.2017 06:00 - 07:00 | 0 | 0 | 0 | 0 |
| 24.02.2017 07:00 - 08:00 | 0 | 0 | 0 | 0 |
| 24.02.2017 08:00 - 09:00 | 0 | 0 | 0 | 0 |
| 24.02.2017 09:00 - 10:00 | 0 | 0 | 0 | 0 |
| 24.02.2017 10:00 - 11:00 | 0 | 0 | 0 | 0 |
| 24.02.2017 11:00 - 12:00 | 0 | 0 | 0 | 0 |
| 24.02.2017 12:00 - 13:00 | 0 | 0 | 0 | 0 |
| 24.02.2017 13:00 - 14:00 | 0 | 0 | 0 | 0 |
| 24.02.2017 14:00 - 15:00 | 0 | 0 | 0 | 0 |
| 24.02.2017 15:00 - 16:00 | 0 | 0 | 0 | 0 |
| 24.02.2017 16:00 - 17:00 | 0 | 0 | 0 | 0 |
| 24.02.2017 17:00 - 18:00 | 0 | 0 | 0 | 0 |
| 24.02.2017 18:00 - 19:00 | 0 | 0 | 0 | 0 |
| 24.02.2017 19:00 - 20:00 | 0 | 0 | 0 | 0 |
| 24.02.2017 20:00 - 21:00 | 0 | 0 | 0 | 0 |
| 24.02.2017 21:00 - 22:00 | 0 | 0 | 0 | 0 |
| 24.02.2017 22:00 - 23:00 | 0 | 0 | 0 | 0 |
| 24.02.2017 23:00 - 24:00 | 0 | 0 | 0 | 0 |
| 25.02.2017 00:00 - 01:00 | 0 | 0 | 0 | 0 |
| 25.02.2017 01:00 - 02:00 | 0 | 0 | 0 | 0 |
| 25.02.2017 02:00 - 03:00 | 0 | 0 | 0 | 0 |
| 25.02.2017 03:00 - 04:00 | 0 | 0 | 0 | 0 |
| 25.02.2017 04:00 - 05:00 | 0 | 0 | 0 | 0 |
| 25.02.2017 05:00 - 06:00 | 0 | 0 | 0 | 0 |
| 25.02.2017 06:00 - 07:00 | 0 | 0 | 0 | 0 |
| 25.02.2017 07:00 - 08:00 | 0 | 0 | 0 | 0 |
| 25.02.2017 08:00 - 09:00 | 0 | 0 | 0 | 0 |
| 25.02.2017 09:00 - 10:00 | 0 | 0 | 0 | 0 |
| 25.02.2017 10:00 - 11:00 | 0 | 0 | 0 | 0 |
| 25.02.2017 11:00 - 12:00 | 0 | 0 | 0 | 0 |
| 25.02.2017 12:00 - 13:00 | 0 | 0 | 0 | 0 |
| 25.02.2017 13:00 - 14:00 | 0 | 0 | 0 | 0 |
| 25.02.2017 14:00 - 15:00 | 0 | 0 | 0 | 0 |
| 25.02.2017 15:00 - 16:00 | 0 | 0 | 0 | 0 |
| 25.02.2017 16:00 - 17:00 | 0 | 0 | 0 | 0 |
| 25.02.2017 17:00 - 18:00 | 0 | 0 | 0 | 0 |
| 25.02.2017 18:00 - 19:00 | 0 | 0 | 0 | 0 |
| 25.02.2017 19:00 - 20:00 | 0 | 0 | 0 | 0 |
| 25.02.2017 20:00 - 21:00 | 0 | 0 | 0 | 0 |
| 25.02.2017 21:00 - 22:00 | 0 | 0 | 0 | 0 |
| 25.02.2017 22:00 - 23:00 | 0 | 0 | 0 | 0 |
| 25.02.2017 23:00 - 24:00 | 0 | 0 | 0 | 0 |
| 26.02.2017 00:00 - 01:00 | 0 | 0 | 0 | 0 |
| 26.02.2017 01:00 - 02:00 | 0 | 0 | 0 | 0 |
| 26.02.2017 02:00 - 03:00 | 0 | 0 | 0 | 0 |
| 26.02.2017 03:00 - 04:00 | 0 | 0 | 0 | 0 |
| 26.02.2017 04:00 - 05:00 | 0 | 0 | 0 | 0 |
| 26.02.2017 05:00 - 06:00 | 0 | 0 | 0 | 0 |
| 26.02.2017 06:00 - 07:00 | 0 | 0 | 0 | 0 |
| 26.02.2017 07:00 - 08:00 | 0 | 0 | 0 | 0 |
| 26.02.2017 08:00 - 09:00 | 0 | 0 | 0 | 0 |
| 26.02.2017 09:00 - 10:00 | 0 | 0 | 0 | 0 |
| 26.02.2017 10:00 - 11:00 | 0 | 0 | 0 | 0 |
| 26.02.2017 11:00 - 12:00 | 0 | 0 | 0 | 0 |
| 26.02.2017 12:00 - 13:00 | 0 | 0 | 0 | 0 |
| 26.02.2017 13:00 - 14:00 | 0 | 0 | 0 | 0 |
| 26.02.2017 14:00 - 15:00 | 0 | 0 | 0 | 0 |
| 26.02.2017 15:00 - 16:00 | 0 | 0 | 0 | 0 |
| 26.02.2017 16:00 - 17:00 | 0 | 0 | 0 | 0 |
| 26.02.2017 17:00 - 18:00 | 0 | 0 | 0 | 0 |
| 26.02.2017 18:00 - 19:00 | 0 | 0 | 0 | 0 |
| 26.02.2017 19:00 - 20:00 | 0 | 0 | 0 | 0 |
| 26.02.2017 20:00 - 21:00 | 0 | 0 | 0 | 0 |
| 26.02.2017 21:00 - 22:00 | 0 | 0 | 0 | 0 |
| 26.02.2017 22:00 - 23:00 | 0 | 0 | 0 | 0 |
| 26.02.2017 23:00 - 24:00 | 0 | 0 | 0 | 0 |
| 27.02.2017 00:00 - 01:00 | 0 | 0 | 0 | 0 |
| 27.02.2017 01:00 - 02:00 | 0 | 0 | 0 | 0 |
| 27.02.2017 02:00 - 03:00 | 500 | 0 | 0 | 0 |
| 27.02.2017 03:00 - 04:00 | 800 | 0 | 0 | 0 |
| 27.02.2017 04:00 - 05:00 | 800 | 0 | 0 | 0 |
| 27.02.2017 05:00 - 06:00 | 800 | 0 | 0 | 0 |
| 27.02.2017 06:00 - 07:00 | 0 | 0 | 0 | 0 |
| 27.02.2017 07:00 - 08:00 | 0 | 0 | 0 | 0 |
| 27.02.2017 08:00 - 09:00 | 0 | 0 | 0 | 0 |
| 27.02.2017 09:00 - 10:00 | 0 | 0 | 0 | 0 |
| 27.02.2017 10:00 - 11:00 | 0 | 0 | 0 | 0 |
| 27.02.2017 11:00 - 12:00 | 0 | 0 | 0 | 0 |
| 27.02.2017 12:00 - 13:00 | 0 | 0 | 0 | 0 |
| 27.02.2017 13:00 - 14:00 | 0 | 0 | 0 | 0 |
| 27.02.2017 14:00 - 15:00 | 300 | 0 | 0 | 0 |
| 27.02.2017 15:00 - 16:00 | 300 | 0 | 0 | 0 |
| 27.02.2017 16:00 - 17:00 | 300 | 0 | 0 | 0 |
| 27.02.2017 17:00 - 18:00 | 300 | 0 | 0 | 0 |
| 27.02.2017 18:00 - 19:00 | 300 | 0 | 0 | 0 |
| 27.02.2017 19:00 - 20:00 | 300 | 0 | 0 | 0 |
| 27.02.2017 20:00 - 21:00 | 300 | 0 | 0 | 0 |
| 27.02.2017 21:00 - 22:00 | 300 | 0 | 0 | 0 |
| 27.02.2017 22:00 - 23:00 | 300 | 0 | 0 | 0 |
| 27.02.2017 23:00 - 24:00 | 300 | 0 | 0 | 0 |
| 28.02.2017 00:00 - 01:00 | 300 | 0 | 0 | 0 |
| 28.02.2017 01:00 - 02:00 | 700 | 0 | 0 | 0 |
| 28.02.2017 02:00 - 03:00 | 700 | 0 | 0 | 0 |
| 28.02.2017 03:00 - 04:00 | 1200 | 0 | 0 | 0 |
| 28.02.2017 04:00 - 05:00 | 1200 | 0 | 0 | 0 |
| 28.02.2017 05:00 - 06:00 | 1200 | 0 | 0 | 0 |
| 28.02.2017 06:00 - 07:00 | 0 | 0 | 0 | 0 |
| 28.02.2017 07:00 - 08:00 | 0 | 0 | 0 | 0 |
| 28.02.2017 08:00 - 09:00 | 0 | 0 | 0 | 0 |
| 28.02.2017 09:00 - 10:00 | 0 | 0 | 0 | 0 |
| 28.02.2017 10:00 - 11:00 | 0 | 0 | 0 | 0 |
| 28.02.2017 11:00 - 12:00 | 0 | 0 | 0 | 0 |
| 28.02.2017 12:00 - 13:00 | 0 | 0 | 0 | 0 |
| 28.02.2017 13:00 - 14:00 | 0 | 0 | 0 | 0 |
| 28.02.2017 14:00 - 15:00 | 0 | 0 | 0 | 0 |
| 28.02.2017 15:00 - 16:00 | 0 | 0 | 0 | 0 |
| 28.02.2017 16:00 - 17:00 | 0 | 0 | 0 | 0 |
| 28.02.2017 17:00 - 18:00 | 0 | 0 | 0 | 0 |
| 28.02.2017 18:00 - 19:00 | 0 | 0 | 0 | 0 |
| 28.02.2017 19:00 - 20:00 | 0 | 0 | 0 | 0 |
| 28.02.2017 20:00 - 21:00 | 0 | 0 | 0 | 0 |
| 28.02.2017 21:00 - 22:00 | 0 | 0 | 0 | 0 |
| 28.02.2017 22:00 - 23:00 | 0 | 0 | 0 | 0 |
| 28.02.2017 23:00 - 24:00 | 300 | 0 | 0 | 0 |
| 01.03.2017 00:00 - 01:00 | 300 | 0 | 0 | 0 |
| 01.03.2017 01:00 - 02:00 | 300 | 0 | 0 | 0 |
| 01.03.2017 02:00 - 03:00 | 300 | 0 | 0 | 0 |
| 01.03.2017 03:00 - 04:00 | 300 | 0 | 0 | 0 |
| 01.03.2017 04:00 - 05:00 | 300 | 0 | 0 | 0 |
| 01.03.2017 05:00 - 06:00 | 300 | 0 | 0 | 0 |